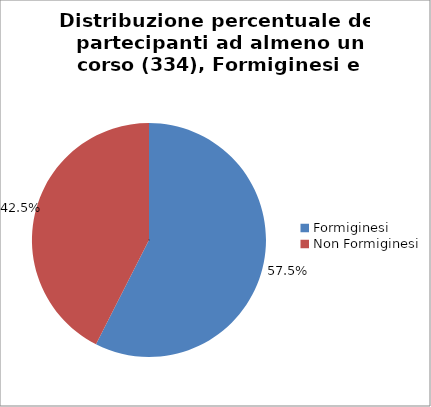
| Category | Nr. Tesserati |
|---|---|
| Formiginesi | 192 |
| Non Formiginesi | 142 |